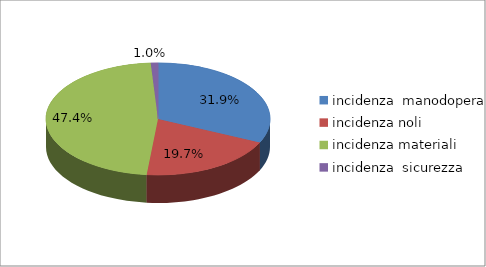
| Category | Series 0 |
|---|---|
| incidenza  manodopera  | 0.319 |
| incidenza noli  | 0.197 |
| incidenza materiali | 0.474 |
| incidenza  sicurezza | 0.01 |